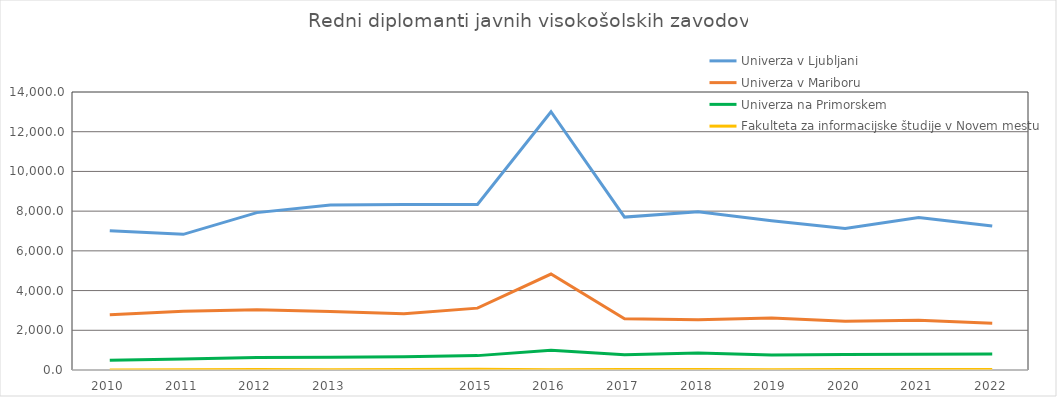
| Category | Univerza v Ljubljani | Univerza v Mariboru | Univerza na Primorskem | Fakulteta za informacijske študije v Novem mestu |
|---|---|---|---|---|
| 2010.0 | 7007 | 2787 | 487 | 5 |
| 2011.0 | 6831.5 | 2963 | 559 | 11 |
| 2012.0 | 7925 | 3031 | 632 | 19 |
| 2013.0 | 8314 | 2948.5 | 638 | 17 |
| nan | 8329 | 2835.5 | 668 | 27 |
| 2015.0 | 8337 | 3115 | 724 | 33 |
| 2016.0 | 13005.5 | 4831.5 | 993 | 15 |
| 2017.0 | 7701.5 | 2581.5 | 770.5 | 29 |
| 2018.0 | 7963 | 2528.5 | 862 | 26 |
| 2019.0 | 7515.5 | 2622 | 750 | 17 |
| 2020.0 | 7121 | 2450 | 775 | 24 |
| 2021.0 | 7678 | 2506.5 | 794 | 30 |
| 2022.0 | 7248 | 2353 | 800 | 23 |